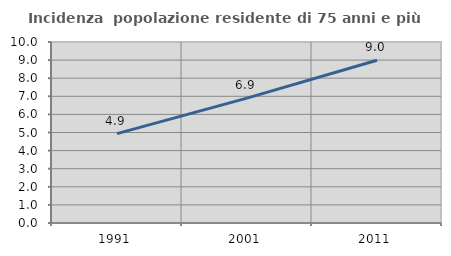
| Category | Incidenza  popolazione residente di 75 anni e più |
|---|---|
| 1991.0 | 4.938 |
| 2001.0 | 6.902 |
| 2011.0 | 8.992 |